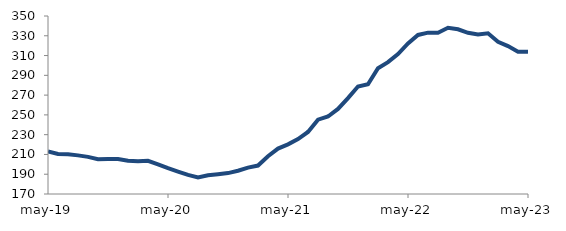
| Category | Series 0 |
|---|---|
| 2019-05-01 | 213.044 |
| 2019-06-01 | 210.411 |
| 2019-07-01 | 210.303 |
| 2019-08-01 | 209.058 |
| 2019-09-01 | 207.556 |
| 2019-10-01 | 205.179 |
| 2019-11-01 | 205.444 |
| 2019-12-01 | 205.45 |
| 2020-01-01 | 203.595 |
| 2020-02-01 | 202.996 |
| 2020-03-01 | 203.606 |
| 2020-04-01 | 199.997 |
| 2020-05-01 | 196.129 |
| 2020-06-01 | 192.644 |
| 2020-07-01 | 189.309 |
| 2020-08-01 | 186.635 |
| 2020-09-01 | 188.903 |
| 2020-10-01 | 189.967 |
| 2020-11-01 | 191.14 |
| 2020-12-01 | 193.522 |
| 2021-01-01 | 196.705 |
| 2021-02-01 | 198.76 |
| 2021-03-01 | 208.155 |
| 2021-04-01 | 215.916 |
| 2021-05-01 | 220.213 |
| 2021-06-01 | 225.532 |
| 2021-07-01 | 232.751 |
| 2021-08-01 | 245.217 |
| 2021-09-01 | 248.367 |
| 2021-10-01 | 256.011 |
| 2021-11-01 | 267.005 |
| 2021-12-01 | 278.738 |
| 2022-01-01 | 281.024 |
| 2022-02-01 | 297.23 |
| 2022-03-01 | 303.362 |
| 2022-04-01 | 311.514 |
| 2022-05-01 | 322.269 |
| 2022-06-01 | 330.847 |
| 2022-07-01 | 333.173 |
| 2022-08-01 | 333.056 |
| 2022-09-01 | 338.053 |
| 2022-10-01 | 336.541 |
| 2022-11-01 | 333.017 |
| 2022-12-01 | 331.349 |
| 2023-01-01 | 332.533 |
| 2023-02-01 | 323.969 |
| 2023-03-01 | 319.613 |
| 2023-04-01 | 313.925 |
| 2023-05-01 | 313.735 |